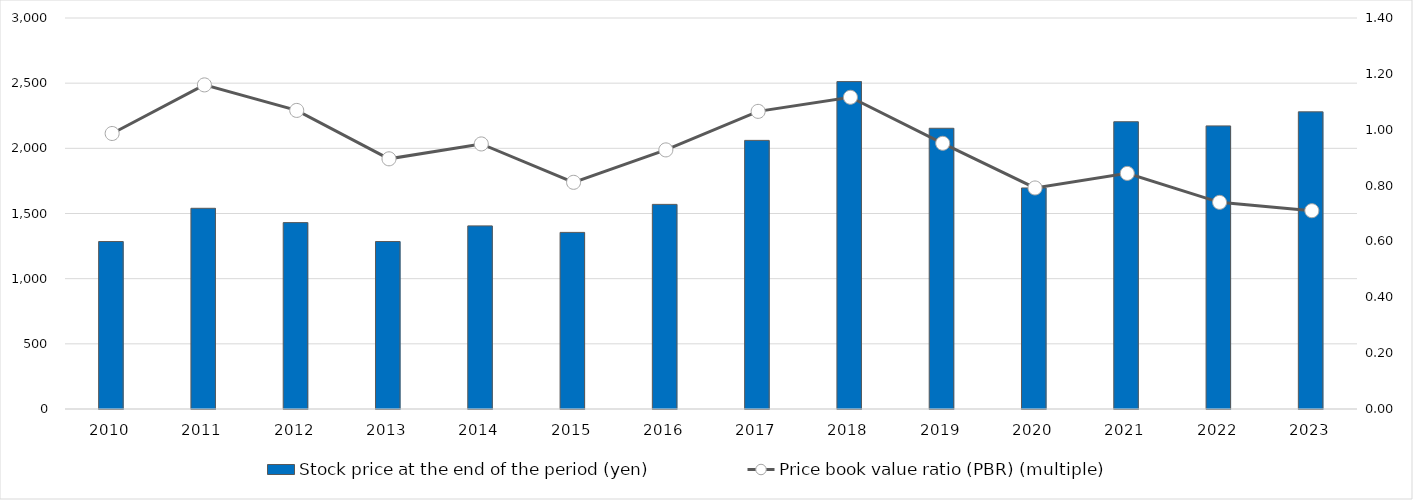
| Category | Stock price at the end of the period (yen) |
|---|---|
| 2010 | 1285 |
| 2011 | 1540 |
| 2012 | 1430 |
| 2013 | 1285 |
| 2014 | 1405 |
| 2015 | 1355 |
| 2016 | 1570 |
| 2017 | 2061 |
| 2018 | 2512 |
| 2019 | 2154 |
| 2020 | 1696 |
| 2021 | 2204 |
| 2022 | 2172 |
| 2023 | 2280 |